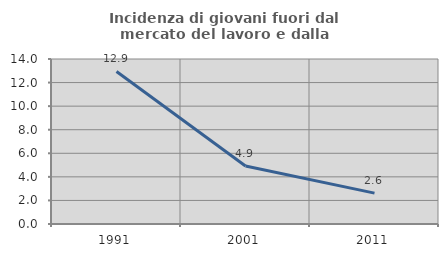
| Category | Incidenza di giovani fuori dal mercato del lavoro e dalla formazione  |
|---|---|
| 1991.0 | 12.941 |
| 2001.0 | 4.921 |
| 2011.0 | 2.622 |